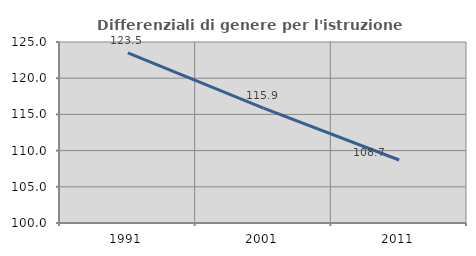
| Category | Differenziali di genere per l'istruzione superiore |
|---|---|
| 1991.0 | 123.483 |
| 2001.0 | 115.871 |
| 2011.0 | 108.704 |